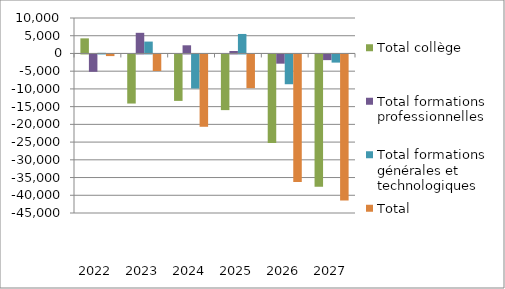
| Category | Total collège | Total formations professionnelles | Total formations générales et technologiques | Total |
|---|---|---|---|---|
| 2022.0 | 4258 | -4896 | 176 | -462 |
| 2023.0 | -13846 | 5821 | 3352 | -4673 |
| 2024.0 | -13100 | 2300 | -9600 | -20400 |
| 2025.0 | -15700 | 700 | 5500 | -9500 |
| 2026.0 | -25000 | -2600 | -8400 | -36000 |
| 2027.0 | -37300 | -1600 | -2300 | -41200 |